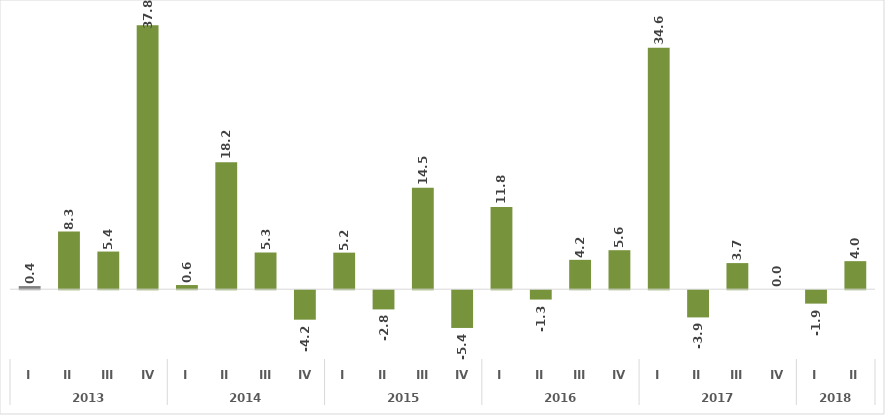
| Category | Series 0 |
|---|---|
| 0 | 0.45 |
| 1 | 8.259 |
| 2 | 5.395 |
| 3 | 37.833 |
| 4 | 0.596 |
| 5 | 18.182 |
| 6 | 5.258 |
| 7 | -4.225 |
| 8 | 5.238 |
| 9 | -2.753 |
| 10 | 14.521 |
| 11 | -5.41 |
| 12 | 11.771 |
| 13 | -1.341 |
| 14 | 4.207 |
| 15 | 5.588 |
| 16 | 34.582 |
| 17 | -3.899 |
| 18 | 3.741 |
| 19 | 0 |
| 20 | -1.924 |
| 21 | 4.018 |